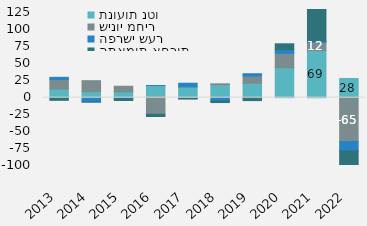
| Category | תנועות נטו | שינוי מחיר | הפרשי שער | התאמות אחרות |
|---|---|---|---|---|
| 2013 | 12733 | 13859.422 | 3401.116 | -3912.845 |
| 2014 | 8776 | 16304.32 | -6255.205 | -268.851 |
| 2015 | 8556 | 8282.683 | -1150.283 | -3046.313 |
| 2016 | 17803 | -24454.332 | 75.483 | -3319.324 |
| 2017 | 15779 | -991.149 | 5529.245 | -1079.465 |
| 2018 | 19027.845 | 1421.458 | -4768.997 | -2416.685 |
| 2019 | 21356.983 | 10529.971 | 3415.478 | -4305.729 |
| 2020 | 44202.613 | 21238.066 | 5326.846 | 8674.345 |
| 2021 | 69365.178 | 12214.466 | 2020.445 | 50748.282 |
| 2022 | 28328 | -64646 | -13736 | -21983 |